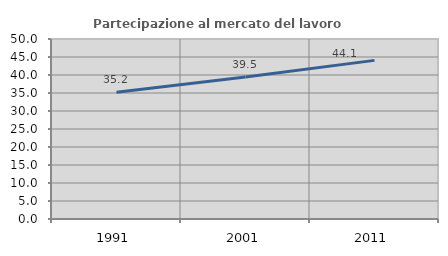
| Category | Partecipazione al mercato del lavoro  femminile |
|---|---|
| 1991.0 | 35.212 |
| 2001.0 | 39.473 |
| 2011.0 | 44.062 |